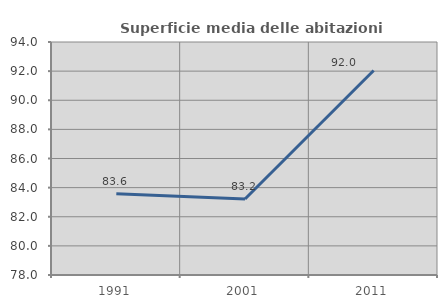
| Category | Superficie media delle abitazioni occupate |
|---|---|
| 1991.0 | 83.577 |
| 2001.0 | 83.221 |
| 2011.0 | 92.043 |